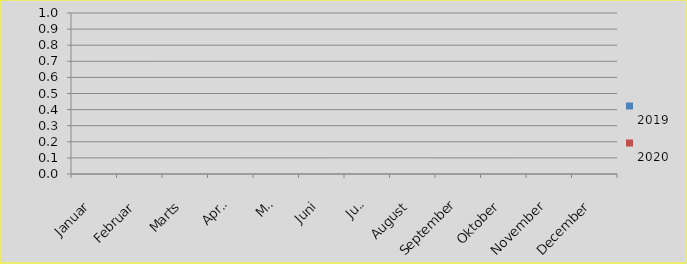
| Category | 
2019 | 
2020 |
|---|---|---|
| Januar |  | 0 |
| Februar |  | 0 |
| Marts |  | 0 |
| April |  | 0 |
| Maj |  | 0 |
| Juni |  | 0 |
| Juli |  | 0 |
| August |  | 0 |
| September |  | 0 |
| Oktober |  | 0 |
| November |  | 0 |
| December |  | 0 |